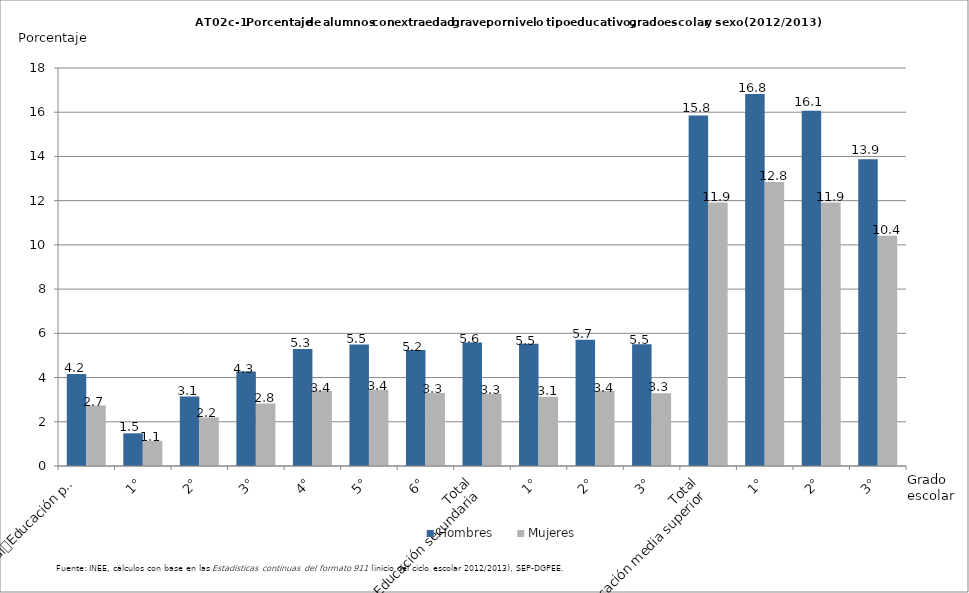
| Category | Hombres | Mujeres |
|---|---|---|
| 0 | 4.163 | 2.731 |
| 1 | 1.479 | 1.135 |
| 2 | 3.141 | 2.198 |
| 3 | 4.272 | 2.829 |
| 4 | 5.29 | 3.415 |
| 5 | 5.494 | 3.449 |
| 6 | 5.248 | 3.3 |
| 7 | 5.582 | 3.272 |
| 8 | 5.524 | 3.136 |
| 9 | 5.715 | 3.405 |
| 10 | 5.507 | 3.291 |
| 11 | 15.846 | 11.912 |
| 12 | 16.825 | 12.849 |
| 13 | 16.066 | 11.915 |
| 14 | 13.874 | 10.419 |